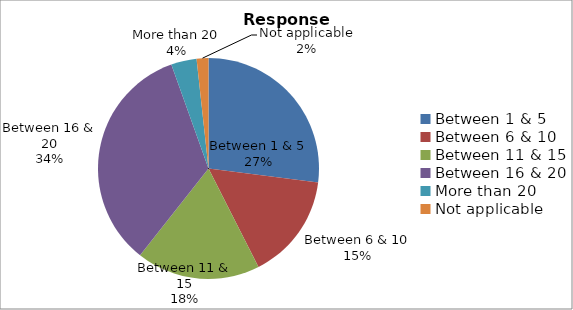
| Category | Series 0 |
|---|---|
| Between 1 & 5 | 94 |
| Between 6 & 10 | 54 |
| Between 11 & 15 | 63 |
| Between 16 & 20 | 118 |
| More than 20 | 13 |
| Not applicable | 6 |